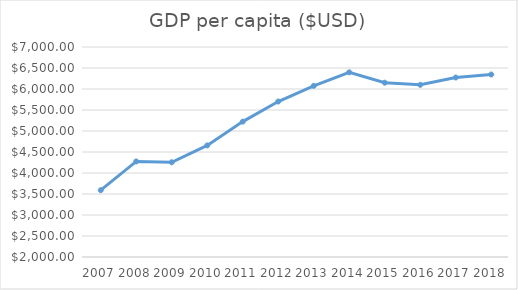
| Category | GDP per capita ($USD) |
|---|---|
| 2007.0 | 3590.712 |
| 2008.0 | 4274.952 |
| 2009.0 | 4255.556 |
| 2010.0 | 4657.302 |
| 2011.0 | 5223.352 |
| 2012.0 | 5702.104 |
| 2013.0 | 6074.091 |
| 2014.0 | 6396.93 |
| 2015.0 | 6150.156 |
| 2016.0 | 6099.315 |
| 2017.0 | 6273.489 |
| 2018.0 | 6344.87 |